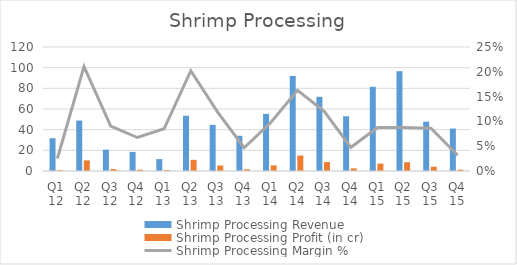
| Category | Shrimp Processing Revenue | Shrimp Processing Profit (in cr) |
|---|---|---|
| Q1 12 | 31.75 | 0.8 |
| Q2 12 | 48.84 | 10.28 |
| Q3 12 | 20.66 | 1.87 |
| Q4 12 | 18.51 | 1.25 |
| Q1 13 | 11.51 | 0.98 |
| Q2 13 | 53.5 | 10.81 |
| Q3 13 | 44.65 | 5.33 |
| Q4 13 | 34.1 | 1.6 |
| Q1 14 | 55.25 | 5.4 |
| Q2 14 | 92.01 | 14.96 |
| Q3 14 | 71.81 | 8.63 |
| Q4 14 | 53.01 | 2.53 |
| Q1 15 | 81.51 | 7.16 |
| Q2 15 | 96.58 | 8.49 |
| Q3 15 | 47.76 | 4.11 |
| Q4 15 | 41.05 | 1.3 |